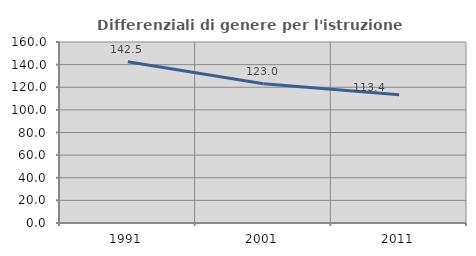
| Category | Differenziali di genere per l'istruzione superiore |
|---|---|
| 1991.0 | 142.486 |
| 2001.0 | 123.032 |
| 2011.0 | 113.351 |